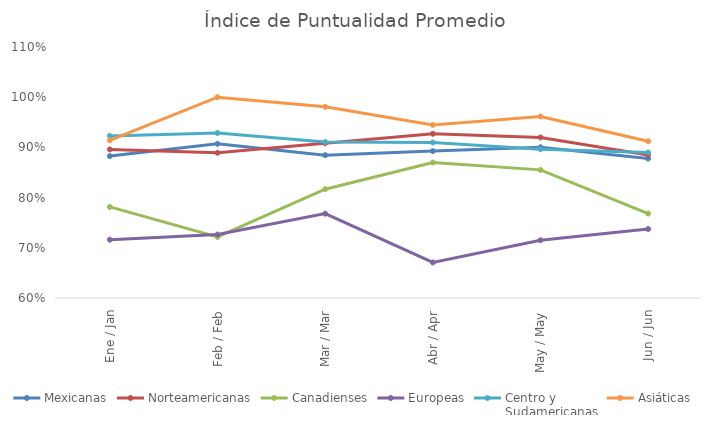
| Category | Mexicanas | Norteamericanas | Canadienses | Europeas | Centro y 
Sudamericanas | Asiáticas |
|---|---|---|---|---|---|---|
| Ene / Jan | 0.883 | 0.896 | 0.781 | 0.716 | 0.923 | 0.914 |
| Feb / Feb | 0.907 | 0.889 | 0.722 | 0.726 | 0.929 | 1 |
| Mar / Mar | 0.885 | 0.908 | 0.817 | 0.768 | 0.911 | 0.981 |
| Abr / Apr | 0.893 | 0.927 | 0.87 | 0.671 | 0.91 | 0.945 |
| May / May | 0.9 | 0.92 | 0.855 | 0.715 | 0.896 | 0.962 |
| Jun / Jun | 0.878 | 0.885 | 0.768 | 0.737 | 0.89 | 0.912 |